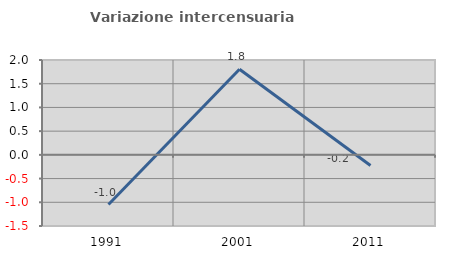
| Category | Variazione intercensuaria annua |
|---|---|
| 1991.0 | -1.048 |
| 2001.0 | 1.804 |
| 2011.0 | -0.223 |